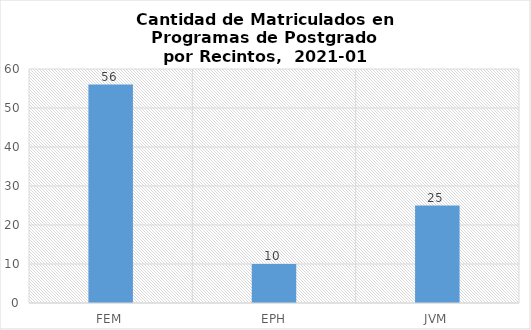
| Category | FEM |
|---|---|
| FEM | 56 |
| EPH | 10 |
| JVM | 25 |